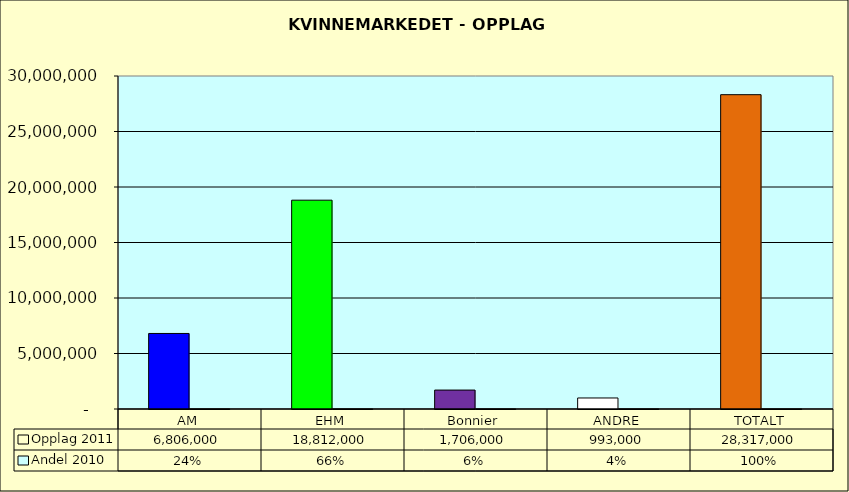
| Category | Opplag 2011 | Andel 2010 |
|---|---|---|
| AM | 6806000 | 0.24 |
| EHM | 18812000 | 0.664 |
| Bonnier | 1706000 | 0.06 |
| ANDRE | 993000 | 0.035 |
| TOTALT | 28317000 | 1 |